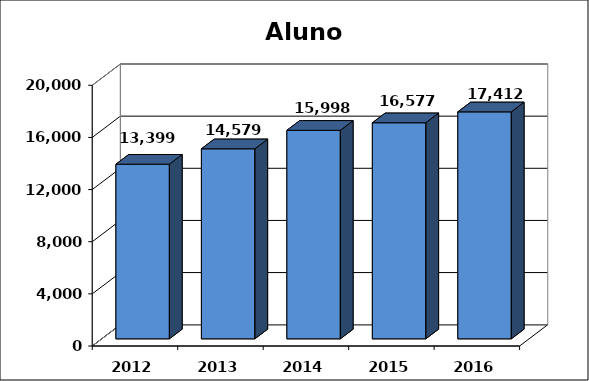
| Category | Series 0 |
|---|---|
| 2012.0 | 13398.5 |
| 2013.0 | 14579 |
| 2014.0 | 15998 |
| 2015.0 | 16576.5 |
| 2016.0 | 17412 |